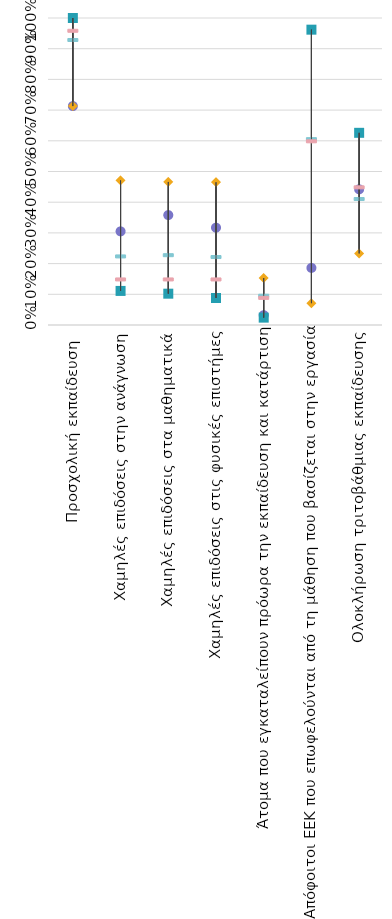
| Category | Greece | Strongest performer | Weakest performer | EU average | EU target |
|---|---|---|---|---|---|
| Προσχολική εκπαίδευση  | 0.713 | 1 | 0.713 | 0.93 | 0.96 |
| Χαμηλές επιδόσεις στην ανάγνωση | 0.305 | 0.111 | 0.471 | 0.225 | 0.15 |
| Χαμηλές επιδόσεις στα μαθηματικά | 0.358 | 0.102 | 0.466 | 0.229 | 0.15 |
| Χαμηλές επιδόσεις στις φυσικές επιστήμες | 0.317 | 0.088 | 0.465 | 0.223 | 0.15 |
| Άτομα που εγκαταλείπουν πρόωρα την εκπαίδευση και κατάρτιση | 0.032 | 0.024 | 0.153 | 0.097 | 0.09 |
| Απόφοιτοι ΕΕΚ που επωφελούνται από τη μάθηση που βασίζεται στην εργασία | 0.186 | 0.962 | 0.071 | 0.607 | 0.6 |
| Ολοκλήρωση τριτοβάθμιας εκπαίδευσης | 0.442 | 0.626 | 0.233 | 0.412 | 0.45 |